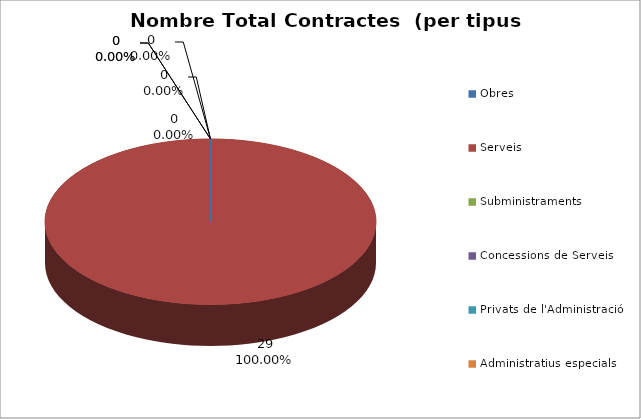
| Category | Nombre Total Contractes |
|---|---|
| Obres | 0 |
| Serveis | 29 |
| Subministraments | 0 |
| Concessions de Serveis | 0 |
| Privats de l'Administració | 0 |
| Administratius especials | 0 |